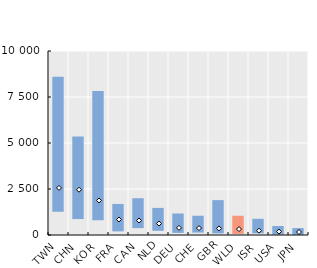
| Category | 25e centile | 25e-75e centiles |
|---|---|---|
| TWN | 1321.306 | 7279.619 |
| CHN | 920.667 | 4432.609 |
| KOR | 851.686 | 6970.74 |
| FRA | 251.08 | 1436.819 |
| CAN | 427.367 | 1570.889 |
| NLD | 282.994 | 1189.318 |
| DEU | 168.183 | 1000.693 |
| CHE | 183.318 | 863.625 |
| GBR | 140.94 | 1754.773 |
| WLD | 115.398 | 930.162 |
| ISR | 144.815 | 734.091 |
| USA | 76.685 | 410.762 |
| JPN | 70.806 | 305.77 |